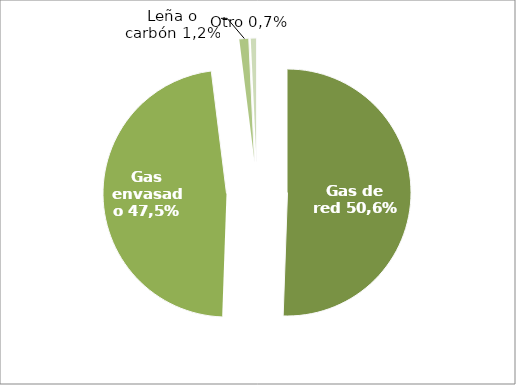
| Category | Series 0 |
|---|---|
| Gas de red | 50.558 |
| Gas envasado | 47.471 |
| Leña o carbón | 1.23 |
| Otro | 0.741 |